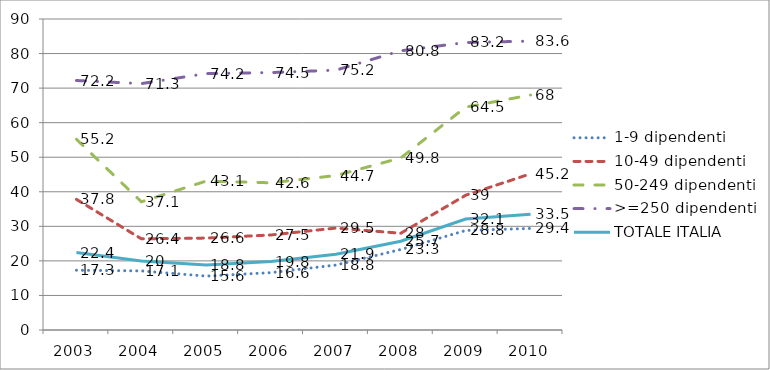
| Category | 1-9 dipendenti | 10-49 dipendenti | 50-249 dipendenti | >=250 dipendenti | TOTALE ITALIA |
|---|---|---|---|---|---|
| 2003.0 | 17.3 | 37.8 | 55.2 | 72.2 | 22.4 |
| 2004.0 | 17.1 | 26.4 | 37.1 | 71.3 | 20 |
| 2005.0 | 15.6 | 26.6 | 43.1 | 74.2 | 18.8 |
| 2006.0 | 16.6 | 27.5 | 42.6 | 74.5 | 19.8 |
| 2007.0 | 18.8 | 29.5 | 44.7 | 75.2 | 21.9 |
| 2008.0 | 23.3 | 28 | 49.8 | 80.8 | 25.7 |
| 2009.0 | 28.8 | 39 | 64.5 | 83.2 | 32.1 |
| 2010.0 | 29.4 | 45.2 | 68 | 83.6 | 33.5 |